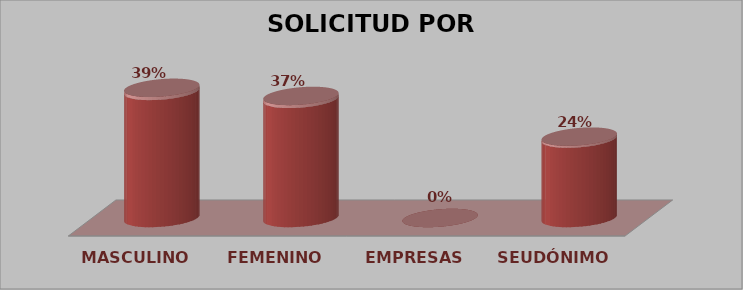
| Category | SOLICITUD POR GÉNERO | Series 1 |
|---|---|---|
| MASCULINO | 16 | 0.39 |
| FEMENINO | 15 | 0.366 |
| EMPRESAS | 0 | 0 |
| SEUDÓNIMO | 10 | 0.244 |